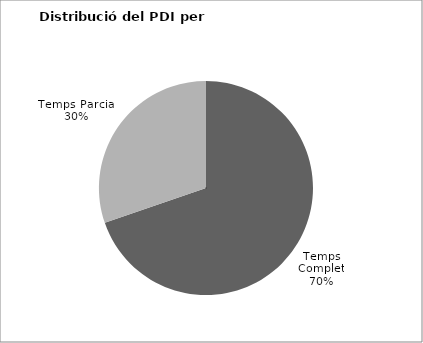
| Category | Series 0 |
|---|---|
| Temps Complet | 1776 |
| Temps Parcial | 771 |